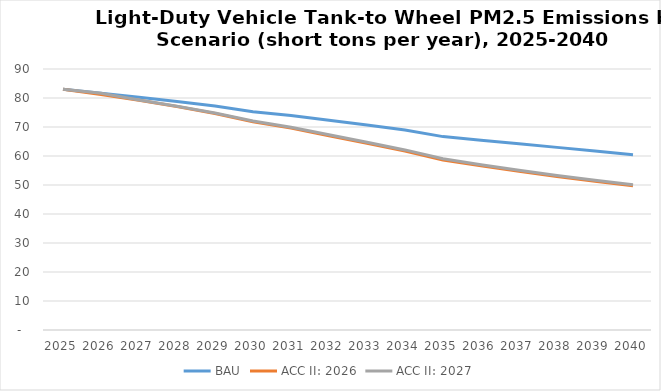
| Category | BAU | ACC II: 2026 | ACC II: 2027 |
|---|---|---|---|
| 2025.0 | 82.99 | 82.99 | 82.99 |
| 2026.0 | 81.61 | 81.189 | 81.61 |
| 2027.0 | 80.227 | 79.203 | 79.277 |
| 2028.0 | 78.765 | 77.038 | 77.159 |
| 2029.0 | 77.223 | 74.685 | 74.858 |
| 2030.0 | 75.253 | 71.836 | 72.06 |
| 2031.0 | 74.003 | 69.614 | 69.89 |
| 2032.0 | 72.362 | 67.003 | 67.324 |
| 2033.0 | 70.67 | 64.36 | 64.718 |
| 2034.0 | 68.941 | 61.716 | 62.1 |
| 2035.0 | 66.687 | 58.645 | 59.043 |
| 2036.0 | 65.461 | 56.596 | 57.003 |
| 2037.0 | 64.235 | 54.718 | 55.12 |
| 2038.0 | 62.973 | 52.913 | 53.3 |
| 2039.0 | 61.732 | 51.282 | 51.643 |
| 2040.0 | 60.46 | 49.744 | 50.066 |